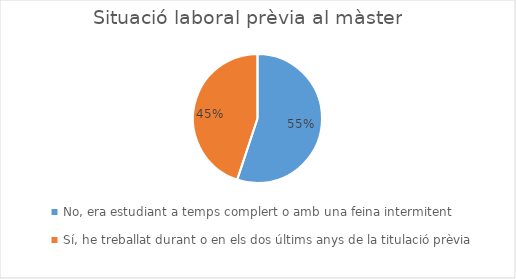
| Category | Series 0 |
|---|---|
| No, era estudiant a temps complert o amb una feina intermitent
 | 27 |
| Sí, he treballat durant o en els dos últims anys de la titulació prèvia | 22 |